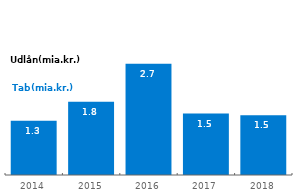
| Category | Tab |
|---|---|
| 2014.0 | 1.337 |
| 2015.0 | 1.801 |
| 2016.0 | 2.739 |
| 2017.0 | 1.509 |
| 2018.0 | 1.467 |